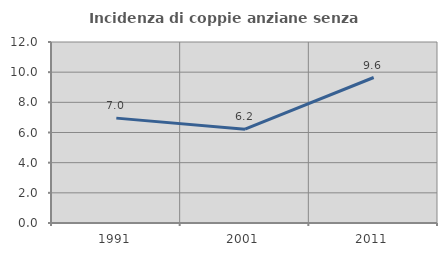
| Category | Incidenza di coppie anziane senza figli  |
|---|---|
| 1991.0 | 6.953 |
| 2001.0 | 6.218 |
| 2011.0 | 9.645 |